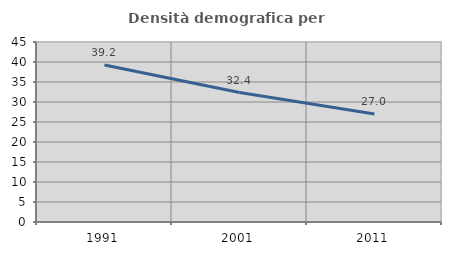
| Category | Densità demografica |
|---|---|
| 1991.0 | 39.246 |
| 2001.0 | 32.358 |
| 2011.0 | 27.002 |